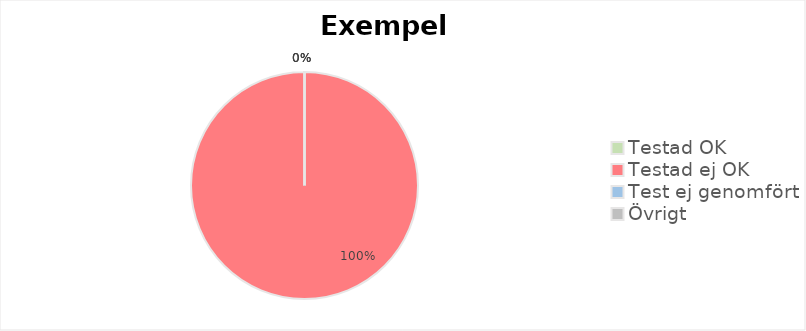
| Category | Series 0 |
|---|---|
| Testad OK | 0 |
| Testad ej OK | 1 |
| Test ej genomfört | 0 |
| Övrigt | 0 |